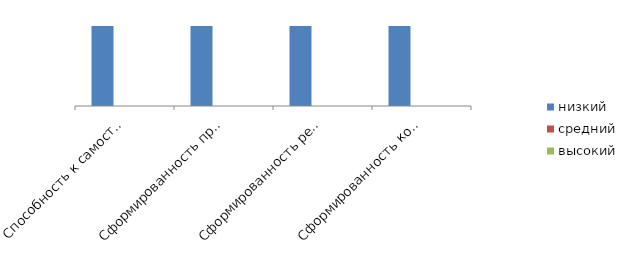
| Category | низкий | средний | высокий |
|---|---|---|---|
| Способность к самостоятельному приобретению знаний и решению проблем | 1 | 0 | 0 |
| Сформированность предметных знаний и способов действий | 1 | 0 | 0 |
| Сформированность регулятивных действий | 1 | 0 | 0 |
| Сформированность коммуникативных действий | 1 | 0 | 0 |